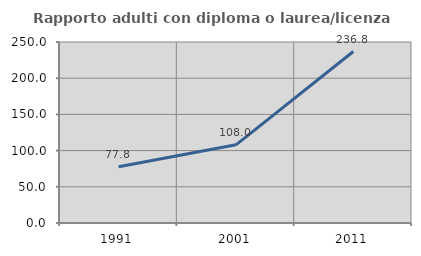
| Category | Rapporto adulti con diploma o laurea/licenza media  |
|---|---|
| 1991.0 | 77.778 |
| 2001.0 | 108 |
| 2011.0 | 236.842 |